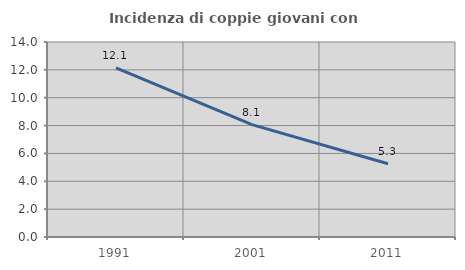
| Category | Incidenza di coppie giovani con figli |
|---|---|
| 1991.0 | 12.143 |
| 2001.0 | 8.065 |
| 2011.0 | 5.263 |